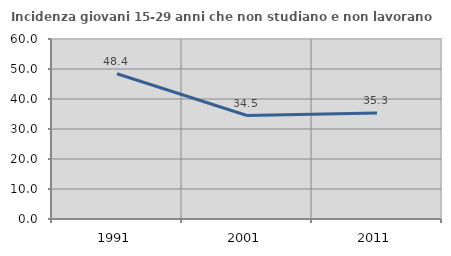
| Category | Incidenza giovani 15-29 anni che non studiano e non lavorano  |
|---|---|
| 1991.0 | 48.414 |
| 2001.0 | 34.483 |
| 2011.0 | 35.294 |